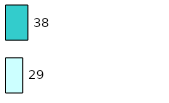
| Category | Series 0 | Series 1 |
|---|---|---|
| 0 | 29 | 38 |